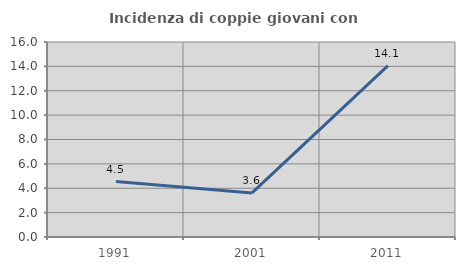
| Category | Incidenza di coppie giovani con figli |
|---|---|
| 1991.0 | 4.545 |
| 2001.0 | 3.614 |
| 2011.0 | 14.062 |